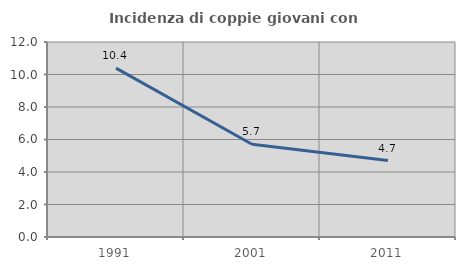
| Category | Incidenza di coppie giovani con figli |
|---|---|
| 1991.0 | 10.394 |
| 2001.0 | 5.705 |
| 2011.0 | 4.706 |